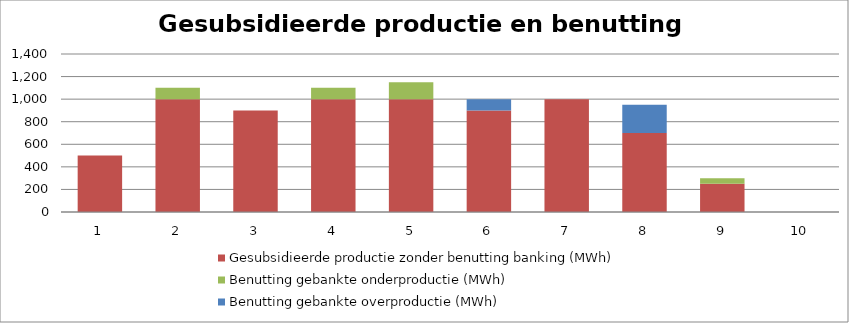
| Category | Gesubsidieerde productie zonder benutting banking (MWh) | Benutting gebankte onderproductie (MWh) | Benutting gebankte overproductie (MWh) |
|---|---|---|---|
| 0 | 500 | 0 | 0 |
| 1 | 1000 | 100 | 0 |
| 2 | 900 | 0 | 0 |
| 3 | 1000 | 100 | 0 |
| 4 | 1000 | 150 | 0 |
| 5 | 900 | 0 | 100 |
| 6 | 1000 | 0 | 0 |
| 7 | 700 | 0 | 250 |
| 8 | 250 | 50 | 0 |
| 9 | 0 | 0 | 0 |